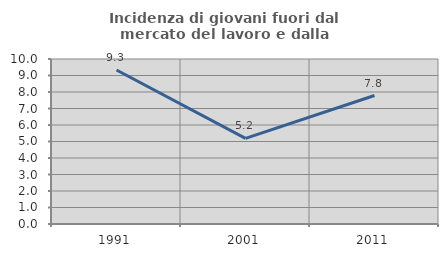
| Category | Incidenza di giovani fuori dal mercato del lavoro e dalla formazione  |
|---|---|
| 1991.0 | 9.335 |
| 2001.0 | 5.192 |
| 2011.0 | 7.787 |